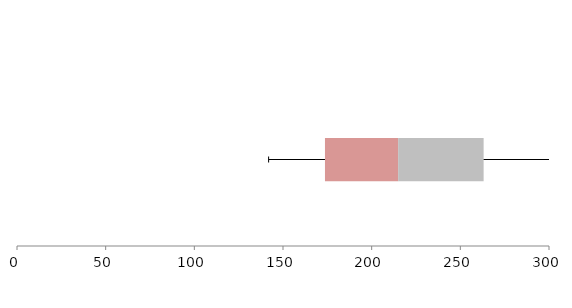
| Category | Series 1 | Series 2 | Series 3 |
|---|---|---|---|
| 0 | 173.668 | 41.262 | 48.204 |